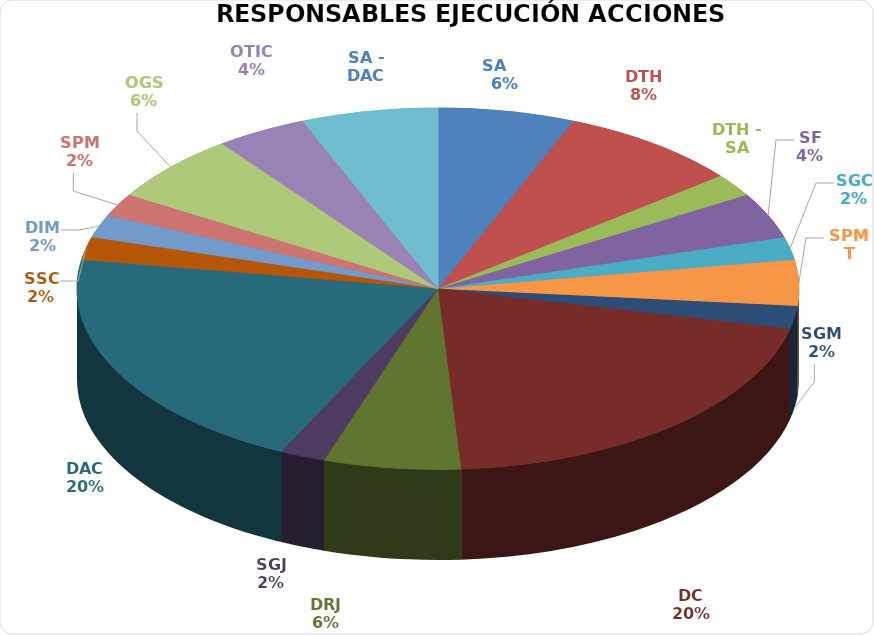
| Category | Series 0 |
|---|---|
| SA     | 3 |
| DTH | 4 |
| DTH - SA | 1 |
| SF | 2 |
| SGC | 1 |
| SPMT | 2 |
| SGM | 1 |
| DC | 10 |
| DRJ | 3 |
| SGJ | 1 |
| DAC | 10 |
| SSC | 1 |
| DIM | 1 |
| SPM | 1 |
| OGS | 3 |
| OTIC | 2 |
| SA - DAC | 3 |